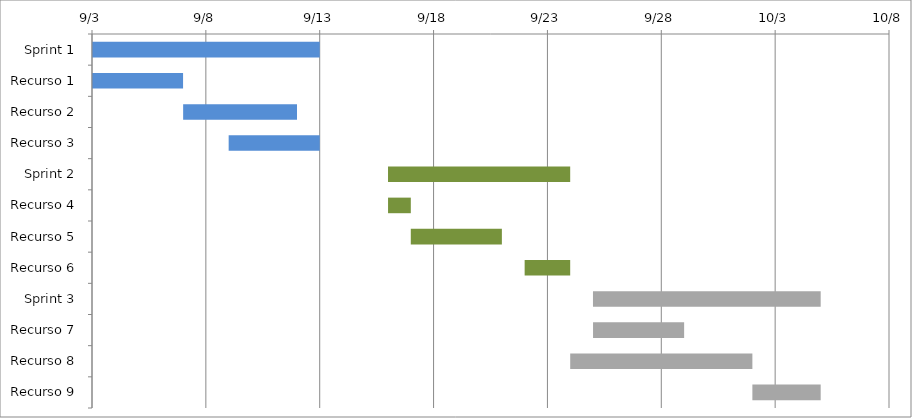
| Category | Início | Dias |
|---|---|---|
| Sprint 1 | 2016-09-03 | 10 |
| Recurso 1 | 2016-09-03 | 4 |
| Recurso 2 | 2016-09-07 | 5 |
| Recurso 3 | 2016-09-09 | 4 |
| Sprint 2 | 2016-09-16 | 8 |
| Recurso 4 | 2016-09-16 | 1 |
| Recurso 5 | 2016-09-17 | 4 |
| Recurso 6 | 2016-09-22 | 2 |
| Sprint 3 | 2016-09-25 | 10 |
| Recurso 7 | 2016-09-25 | 4 |
| Recurso 8 | 2016-09-24 | 8 |
| Recurso 9 | 2016-10-02 | 3 |